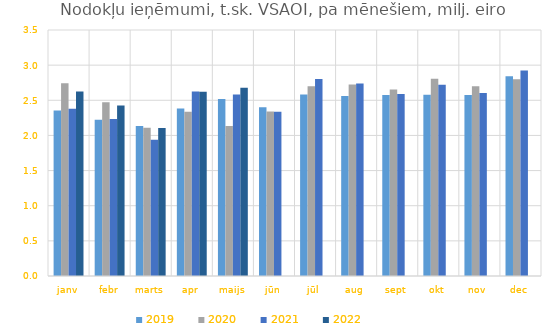
| Category | 2019 | 2020 | 2021 | 2022 |
|---|---|---|---|---|
| janv | 2.356 | 2.744 | 2.379 | 2.624 |
| febr | 2.224 | 2.471 | 2.232 | 2.426 |
| marts | 2.135 | 2.11 | 1.938 | 2.106 |
| apr | 2.385 | 2.336 | 2.626 | 2.623 |
| maijs | 2.517 | 2.132 | 2.583 | 2.68 |
| jūn | 2.4 | 2.34 | 2.335 | 0 |
| jūl | 2.582 | 2.7 | 2.802 | 0 |
| aug | 2.562 | 2.724 | 2.739 | 0 |
| sept | 2.574 | 2.654 | 2.591 | 0 |
| okt | 2.579 | 2.805 | 2.722 | 0 |
| nov | 2.576 | 2.701 | 2.602 | 0 |
| dec | 2.842 | 2.801 | 2.925 | 0 |